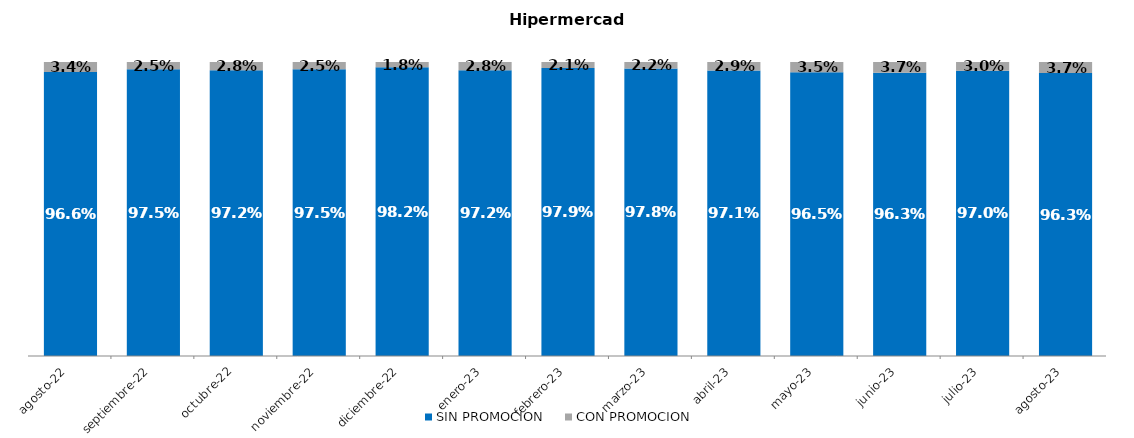
| Category | SIN PROMOCION   | CON PROMOCION   |
|---|---|---|
| 2022-08-01 | 0.966 | 0.034 |
| 2022-09-01 | 0.975 | 0.025 |
| 2022-10-01 | 0.972 | 0.028 |
| 2022-11-01 | 0.975 | 0.025 |
| 2022-12-01 | 0.982 | 0.018 |
| 2023-01-01 | 0.972 | 0.028 |
| 2023-02-01 | 0.979 | 0.021 |
| 2023-03-01 | 0.978 | 0.022 |
| 2023-04-01 | 0.971 | 0.029 |
| 2023-05-01 | 0.965 | 0.035 |
| 2023-06-01 | 0.963 | 0.037 |
| 2023-07-01 | 0.97 | 0.03 |
| 2023-08-01 | 0.963 | 0.037 |